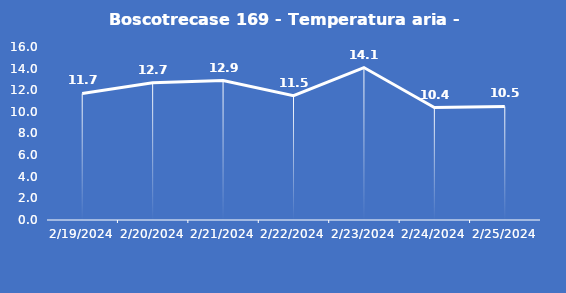
| Category | Boscotrecase 169 - Temperatura aria - Grezzo (°C) |
|---|---|
| 2/19/24 | 11.7 |
| 2/20/24 | 12.7 |
| 2/21/24 | 12.9 |
| 2/22/24 | 11.5 |
| 2/23/24 | 14.1 |
| 2/24/24 | 10.4 |
| 2/25/24 | 10.5 |